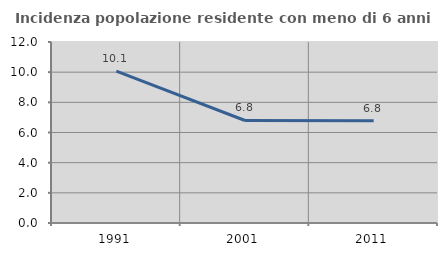
| Category | Incidenza popolazione residente con meno di 6 anni |
|---|---|
| 1991.0 | 10.069 |
| 2001.0 | 6.797 |
| 2011.0 | 6.776 |